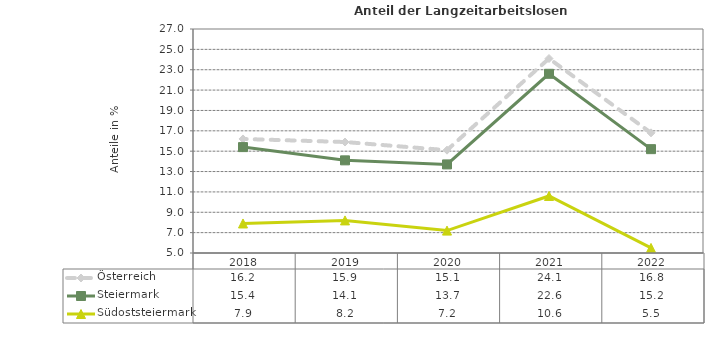
| Category | Österreich | Steiermark | Südoststeiermark |
|---|---|---|---|
| 2022.0 | 16.8 | 15.2 | 5.5 |
| 2021.0 | 24.1 | 22.6 | 10.6 |
| 2020.0 | 15.1 | 13.7 | 7.2 |
| 2019.0 | 15.9 | 14.1 | 8.2 |
| 2018.0 | 16.2 | 15.4 | 7.9 |